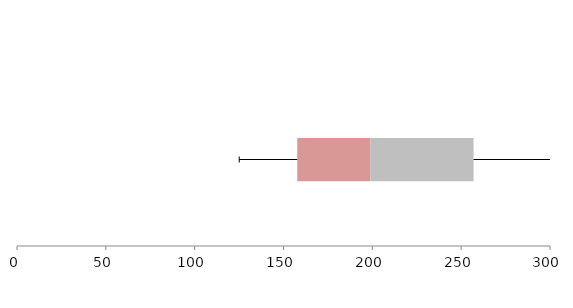
| Category | Series 1 | Series 2 | Series 3 |
|---|---|---|---|
| 0 | 157.748 | 41.235 | 57.988 |